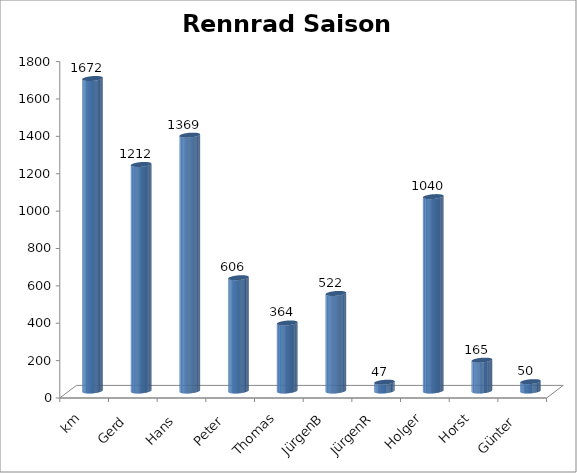
| Category | Series 0 |
|---|---|
| km | 1672 |
| Gerd  | 1212 |
| Hans  | 1369 |
| Peter  | 606 |
| Thomas | 364 |
| JürgenB | 522 |
| JürgenR | 47 |
| Holger | 1040 |
| Horst | 165 |
| Günter  | 50 |